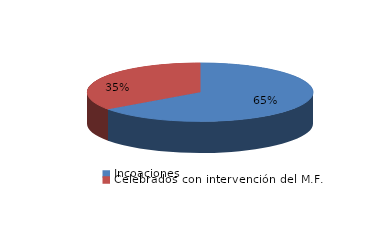
| Category | Series 0 |
|---|---|
| Incoaciones | 2909 |
| Celebrados con intervención del M.F. | 1558 |